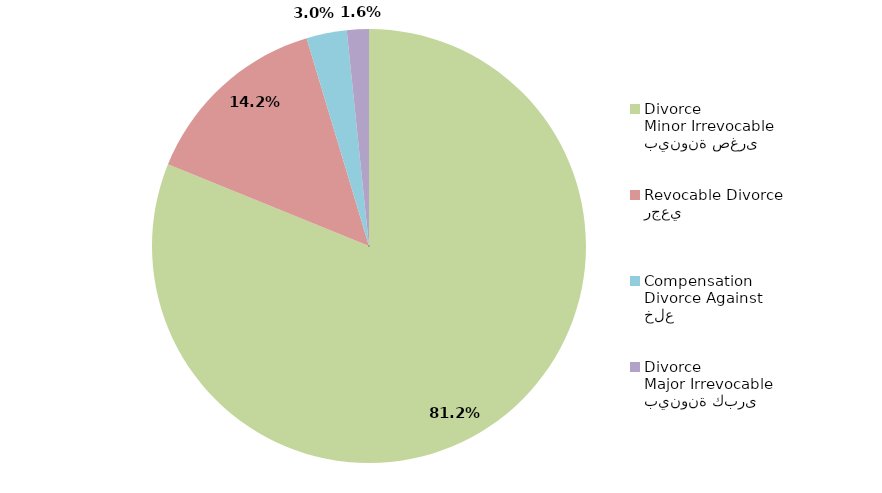
| Category | Series 1 |
|---|---|
| بينونة صغرى
Minor Irrevocable Divorce  | 81.148 |
| رجعي
Revocable Divorce  | 14.208 |
| خلع
Divorce Against Compensation | 3.005 |
| بينونة كبرى
Major Irrevocable Divorce  | 1.639 |